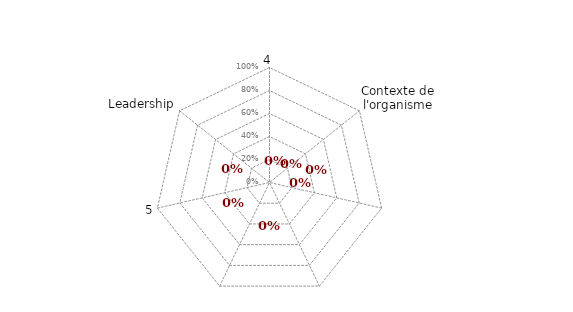
| Category | Conformité des Articles |
|---|---|
| 0 | 0 |
| 1 | 0 |
| 2 | 0 |
| 3 | 0 |
| 4 | 0 |
| 5 | 0 |
| 6 | 0 |